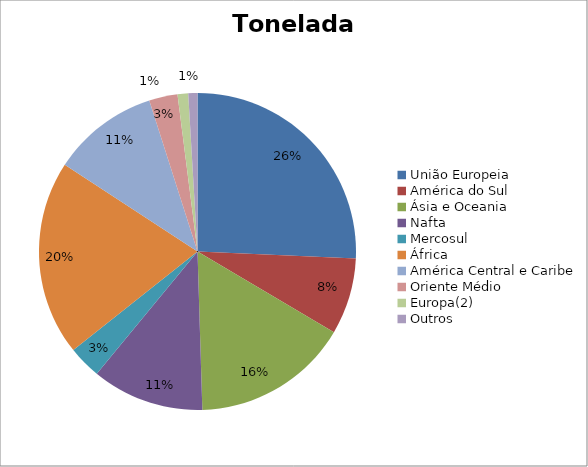
| Category | Series 0 |
|---|---|
| União Europeia | 1162666.697 |
| América do Sul | 352127.246 |
| Ásia e Oceania | 723863.421 |
| Nafta | 517681.892 |
| Mercosul | 152007.245 |
| África | 898885.979 |
| América Central e Caribe | 491793.66 |
| Oriente Médio | 131202.824 |
| Europa(2) | 48900.668 |
| Outros | 42277.926 |